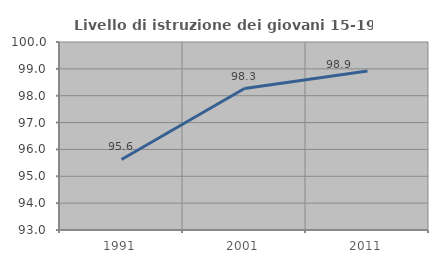
| Category | Livello di istruzione dei giovani 15-19 anni |
|---|---|
| 1991.0 | 95.626 |
| 2001.0 | 98.266 |
| 2011.0 | 98.917 |